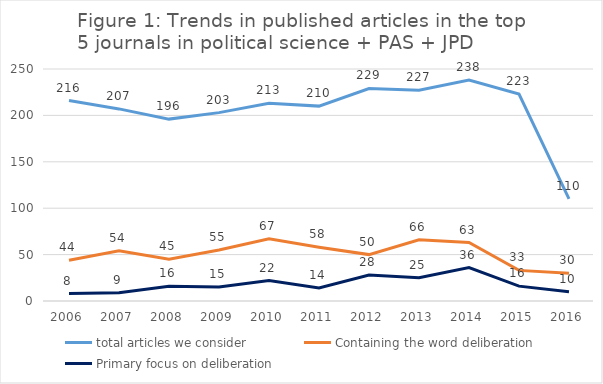
| Category | total articles we consider | Containing the word deliberation | Primary focus on deliberation |
|---|---|---|---|
| 2006.0 | 216 | 44 | 8 |
| 2007.0 | 207 | 54 | 9 |
| 2008.0 | 196 | 45 | 16 |
| 2009.0 | 203 | 55 | 15 |
| 2010.0 | 213 | 67 | 22 |
| 2011.0 | 210 | 58 | 14 |
| 2012.0 | 229 | 50 | 28 |
| 2013.0 | 227 | 66 | 25 |
| 2014.0 | 238 | 63 | 36 |
| 2015.0 | 223 | 33 | 16 |
| 2016.0 | 110 | 30 | 10 |